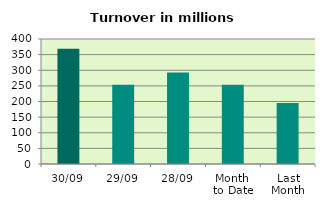
| Category | Series 0 |
|---|---|
| 30/09 | 369.177 |
| 29/09 | 253.846 |
| 28/09 | 292.765 |
| Month 
to Date | 253.961 |
| Last
Month | 194.848 |